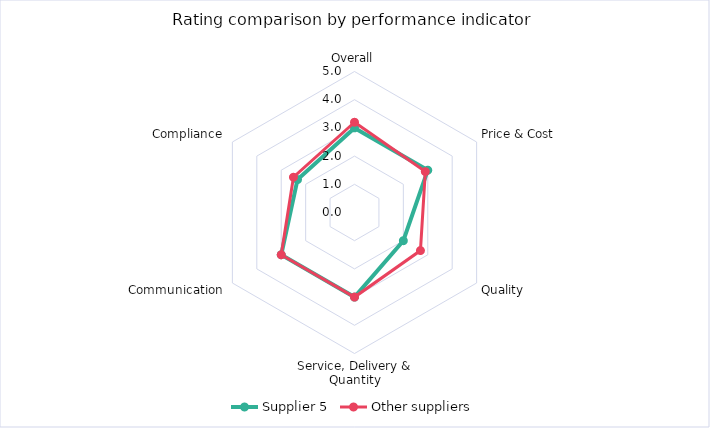
| Category | Supplier 5 | Other suppliers |
|---|---|---|
| Overall | 3 | 3.2 |
| Price & Cost | 3 | 2.9 |
| Quality | 2 | 2.7 |
| Service, Delivery & Quantity | 3 | 3 |
| Communication | 3 | 3 |
| Compliance | 2.333 | 2.5 |